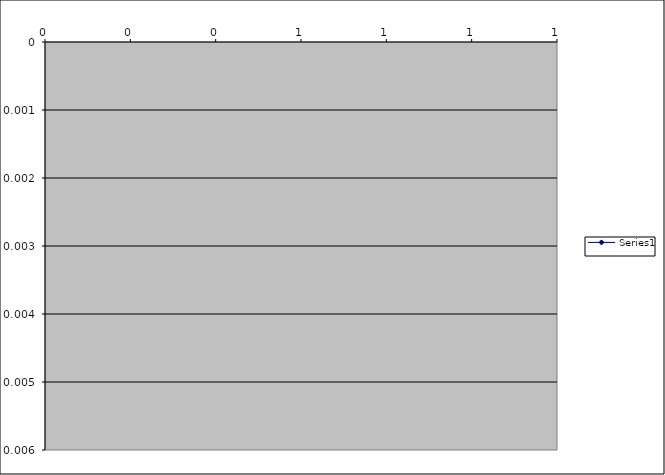
| Category | Series 0 |
|---|---|
|  | 0.005 |
|  | 0.02 |
|  | 0.04 |
|  | 0.07 |
|  | 0.1 |
|  | 0.2 |
|  | 0.3 |
|  | 0.4 |
|  | 0.5 |
|  | 0.6 |
|  | 0.7 |
|  | 0.8 |
|  | 0.9 |
|  | 1 |